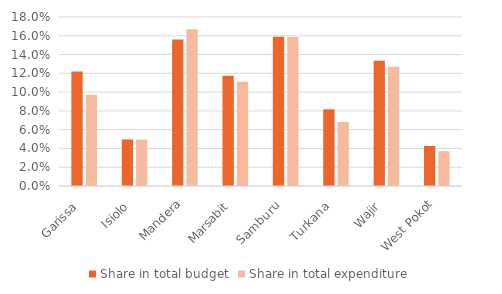
| Category | Share in total budget | Share in total expenditure |
|---|---|---|
| Garissa  | 0.122 | 0.097 |
| Isiolo  | 0.05 | 0.049 |
| Mandera | 0.156 | 0.167 |
| Marsabit  | 0.117 | 0.111 |
| Samburu  | 0.159 | 0.159 |
| Turkana  | 0.082 | 0.068 |
| Wajir  | 0.133 | 0.127 |
| West Pokot | 0.043 | 0.037 |